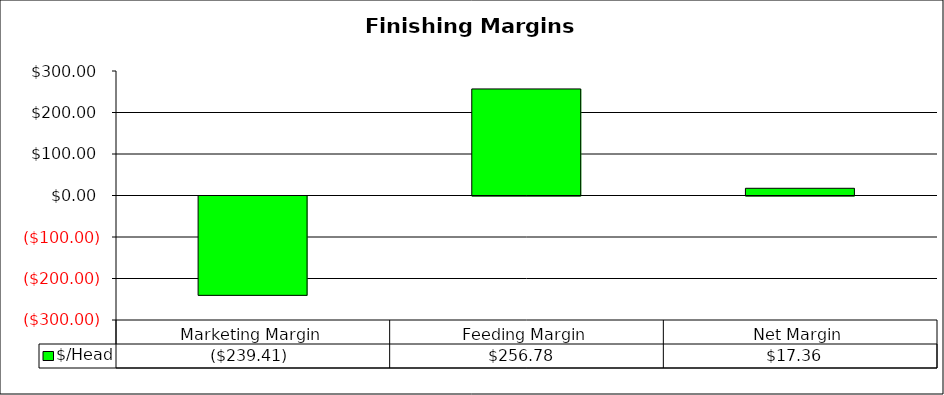
| Category | $/Head |
|---|---|
| Marketing Margin | -239.413 |
| Feeding Margin | 256.776 |
| Net Margin | 17.364 |